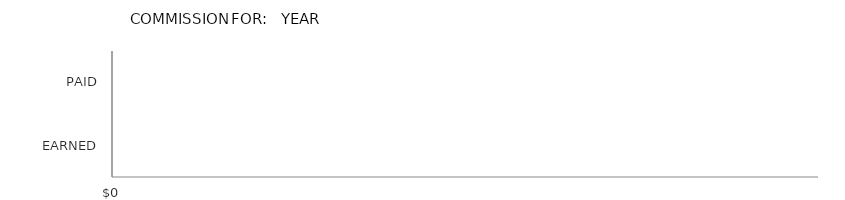
| Category | YEAR |
|---|---|
| EARNED | 67100 |
| PAID | 46200 |